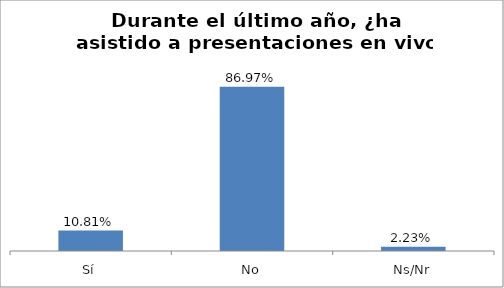
| Category | Total |
|---|---|
| Sí | 0.108 |
| No | 0.87 |
| Ns/Nr | 0.022 |